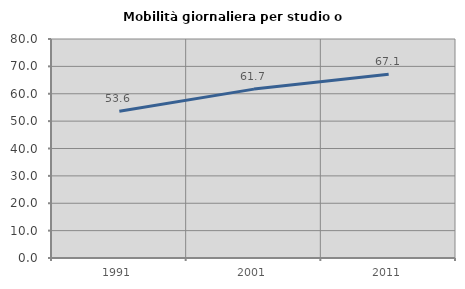
| Category | Mobilità giornaliera per studio o lavoro |
|---|---|
| 1991.0 | 53.581 |
| 2001.0 | 61.696 |
| 2011.0 | 67.148 |